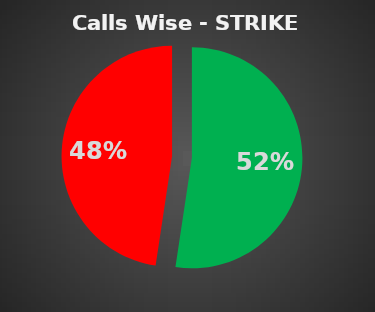
| Category | Series 0 |
|---|---|
| 0 | 0.524 |
| 1 | 0.476 |